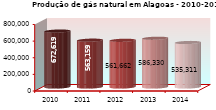
| Category | Gás Natural (1.000 metros cúbicos) |
|---|---|
| 2010.0 | 672619 |
| 2011.0 | 563159.172 |
| 2012.0 | 561662 |
| 2013.0 | 586330 |
| 2014.0 | 535310.652 |